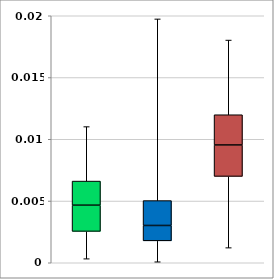
| Category | Series 0 | Series 1 | Series 2 | Series 3 |
|---|---|---|---|---|
| 0 | 0 | 0.002 | 0.002 | 0.002 |
| 1 | 0 | 0.002 | 0.001 | 0.002 |
| 2 | 0.001 | 0.006 | 0.003 | 0.002 |